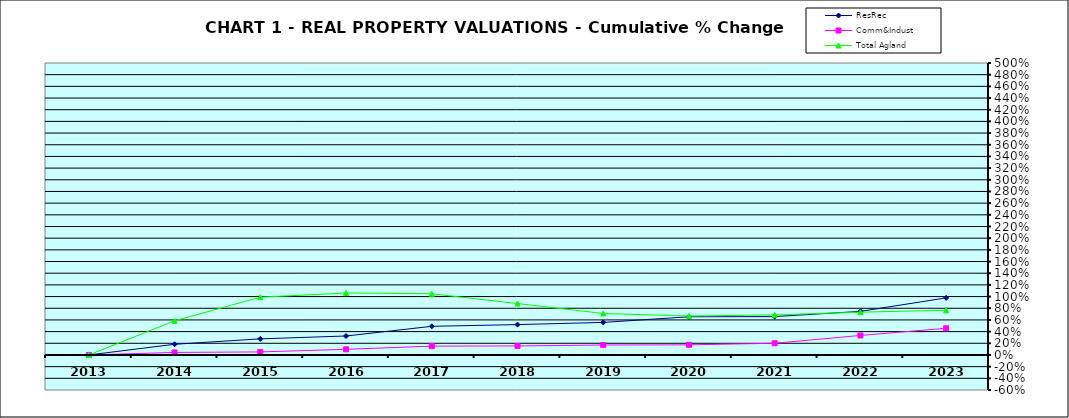
| Category | ResRec | Comm&Indust | Total Agland |
|---|---|---|---|
| 2013.0 | 0 | 0 | 0 |
| 2014.0 | 0.183 | 0.043 | 0.585 |
| 2015.0 | 0.276 | 0.052 | 0.989 |
| 2016.0 | 0.325 | 0.097 | 1.061 |
| 2017.0 | 0.49 | 0.151 | 1.048 |
| 2018.0 | 0.52 | 0.155 | 0.881 |
| 2019.0 | 0.557 | 0.17 | 0.71 |
| 2020.0 | 0.654 | 0.173 | 0.667 |
| 2021.0 | 0.657 | 0.2 | 0.687 |
| 2022.0 | 0.747 | 0.334 | 0.733 |
| 2023.0 | 0.978 | 0.457 | 0.766 |